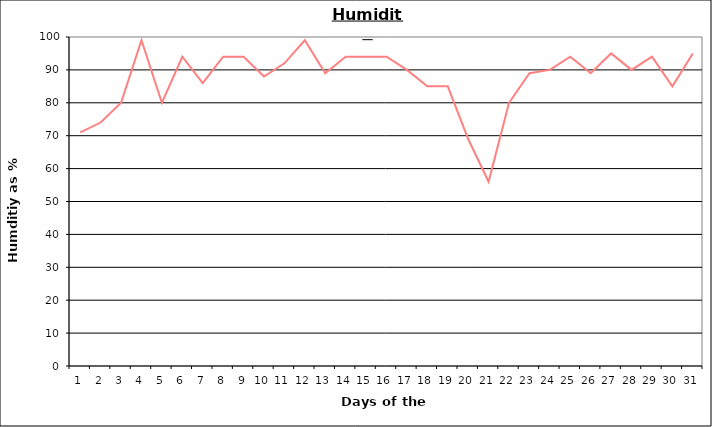
| Category | Series 0 |
|---|---|
| 0 | 71 |
| 1 | 74 |
| 2 | 80 |
| 3 | 99 |
| 4 | 80 |
| 5 | 94 |
| 6 | 86 |
| 7 | 94 |
| 8 | 94 |
| 9 | 88 |
| 10 | 92 |
| 11 | 99 |
| 12 | 89 |
| 13 | 94 |
| 14 | 94 |
| 15 | 94 |
| 16 | 90 |
| 17 | 85 |
| 18 | 85 |
| 19 | 69 |
| 20 | 56 |
| 21 | 80 |
| 22 | 89 |
| 23 | 90 |
| 24 | 94 |
| 25 | 89 |
| 26 | 95 |
| 27 | 90 |
| 28 | 94 |
| 29 | 85 |
| 30 | 95 |